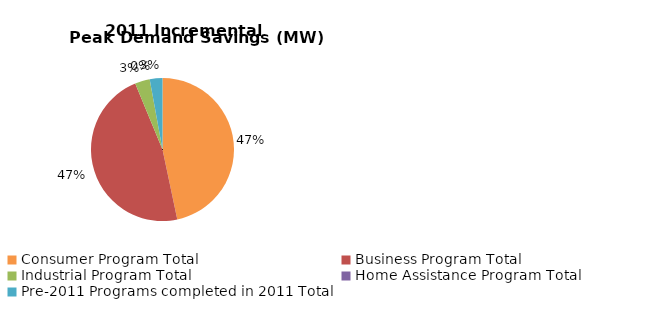
| Category | Incremental Peak Demand Savings (kW) |
|---|---|
| Consumer Program Total | 247.318 |
| Business Program Total | 249.471 |
| Industrial Program Total | 17.788 |
| Home Assistance Program Total | 0 |
| Pre-2011 Programs completed in 2011 Total | 15.214 |